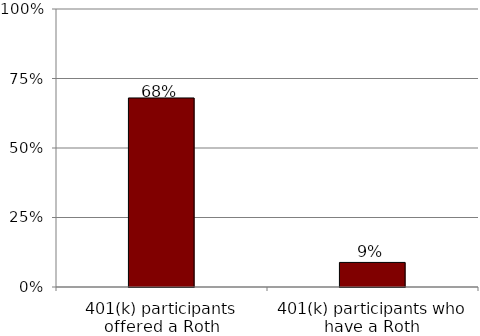
| Category | Series 0 |
|---|---|
| 401(k) participants offered a Roth | 0.68 |
| 401(k) participants who have a Roth | 0.088 |